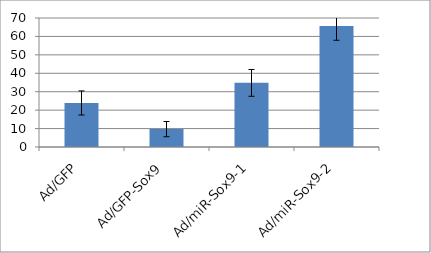
| Category | Series 0 |
|---|---|
| Ad/GFP | 23.9 |
| Ad/GFP-Sox9 | 9.702 |
| Ad/miR-Sox9-1 | 34.798 |
| Ad/miR-Sox9-2 | 65.615 |